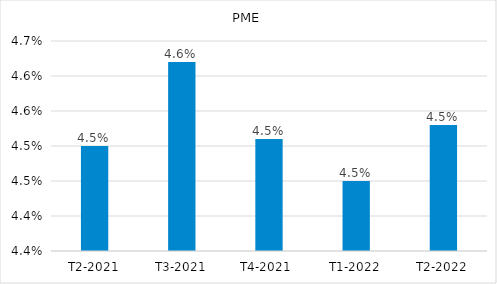
| Category | Series 0 |
|---|---|
| T2-2021 | 0.045 |
| T3-2021 | 0.046 |
| T4-2021  | 0.045 |
| T1-2022 | 0.044 |
| T2-2022 | 0.045 |